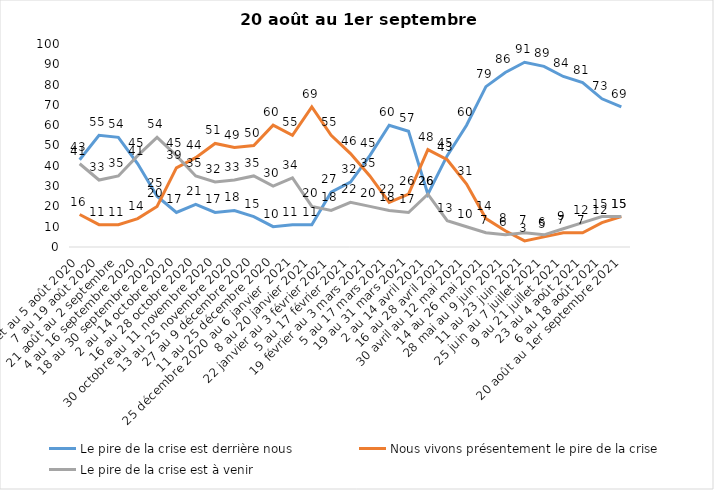
| Category | Le pire de la crise est derrière nous | Nous vivons présentement le pire de la crise | Le pire de la crise est à venir |
|---|---|---|---|
| 24 juillet au 5 août 2020 | 43 | 16 | 41 |
| 7 au 19 août 2020 | 55 | 11 | 33 |
| 21 août au 2 septembre | 54 | 11 | 35 |
| 4 au 16 septembre 2020 | 41 | 14 | 45 |
| 18 au 30 septembre 2020 | 25 | 20 | 54 |
| 2 au 14 octobre 2020 | 17 | 39 | 45 |
| 16 au 28 octobre 2020 | 21 | 44 | 35 |
| 30 octobre au 11 novembre 2020 | 17 | 51 | 32 |
| 13 au 25 novembre 2020 | 18 | 49 | 33 |
| 27 au 9 décembre 2020 | 15 | 50 | 35 |
| 11 au 25 décembre 2020 | 10 | 60 | 30 |
| 25 décembre 2020 au 6 janvier  2021 | 11 | 55 | 34 |
| 8 au 20 janvier 2021 | 11 | 69 | 20 |
| 22 janvier au 3 février 2021 | 27 | 55 | 18 |
| 5 au 17 février 2021 | 32 | 46 | 22 |
| 19 février au 3 mars 2021 | 45 | 35 | 20 |
| 5 au 17 mars 2021 | 60 | 22 | 18 |
| 19 au 31 mars 2021 | 57 | 26 | 17 |
| 2 au 14 avril 2021 | 26 | 48 | 26 |
| 16 au 28 avril 2021 | 45 | 43 | 13 |
| 30 avril au 12 mai 2021 | 60 | 31 | 10 |
| 14 au 26 mai 2021 | 79 | 14 | 7 |
| 28 mai au 9 juin 2021 | 86 | 8 | 6 |
| 11 au 23 juin 2021 | 91 | 3 | 7 |
| 25 juin au 7 juillet 2021 | 89 | 5 | 6 |
| 9 au 21 juillet 2021 | 84 | 7 | 9 |
| 23 au 4 août 2021 | 81 | 7 | 12 |
| 6 au 18 août 2021 | 73 | 12 | 15 |
| 20 août au 1er septembre 2021 | 69 | 15 | 15 |